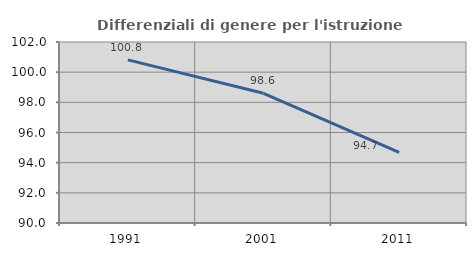
| Category | Differenziali di genere per l'istruzione superiore |
|---|---|
| 1991.0 | 100.814 |
| 2001.0 | 98.6 |
| 2011.0 | 94.687 |